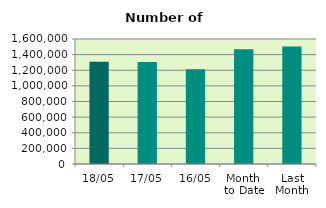
| Category | Series 0 |
|---|---|
| 18/05 | 1308040 |
| 17/05 | 1306360 |
| 16/05 | 1212820 |
| Month 
to Date | 1469593.538 |
| Last
Month | 1505043.474 |